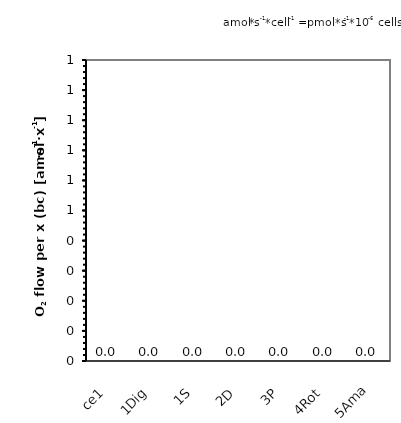
| Category | Series 0 |
|---|---|
| ce1 | 0 |
| 1Dig | 0 |
| 1S | 0 |
| 2D | 0 |
| 3P | 0 |
| 4Rot | 0 |
| 5Ama | 0 |